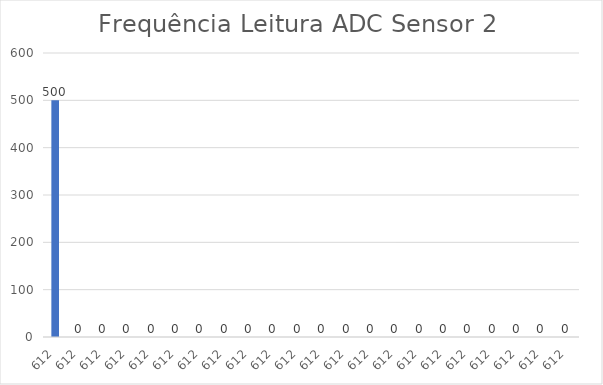
| Category | Series 0 |
|---|---|
| 612.0 | 500 |
| 612.0 | 0 |
| 612.0 | 0 |
| 612.0 | 0 |
| 612.0 | 0 |
| 612.0 | 0 |
| 612.0 | 0 |
| 612.0 | 0 |
| 612.0 | 0 |
| 612.0 | 0 |
| 612.0 | 0 |
| 612.0 | 0 |
| 612.0 | 0 |
| 612.0 | 0 |
| 612.0 | 0 |
| 612.0 | 0 |
| 612.0 | 0 |
| 612.0 | 0 |
| 612.0 | 0 |
| 612.0 | 0 |
| 612.0 | 0 |
| 612.0 | 0 |